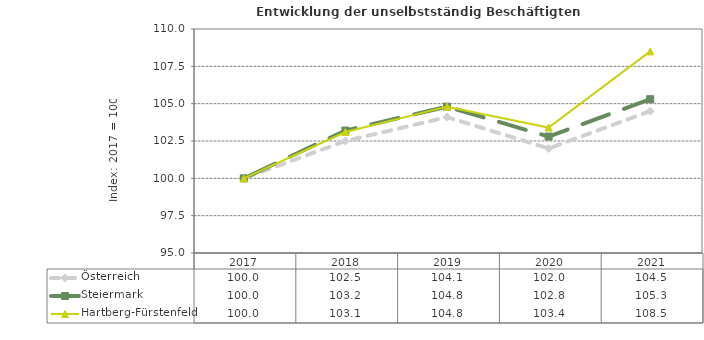
| Category | Österreich | Steiermark | Hartberg-Fürstenfeld |
|---|---|---|---|
| 2021.0 | 104.5 | 105.3 | 108.5 |
| 2020.0 | 102 | 102.8 | 103.4 |
| 2019.0 | 104.1 | 104.8 | 104.8 |
| 2018.0 | 102.5 | 103.2 | 103.1 |
| 2017.0 | 100 | 100 | 100 |